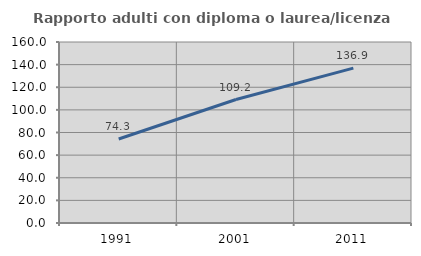
| Category | Rapporto adulti con diploma o laurea/licenza media  |
|---|---|
| 1991.0 | 74.25 |
| 2001.0 | 109.157 |
| 2011.0 | 136.896 |